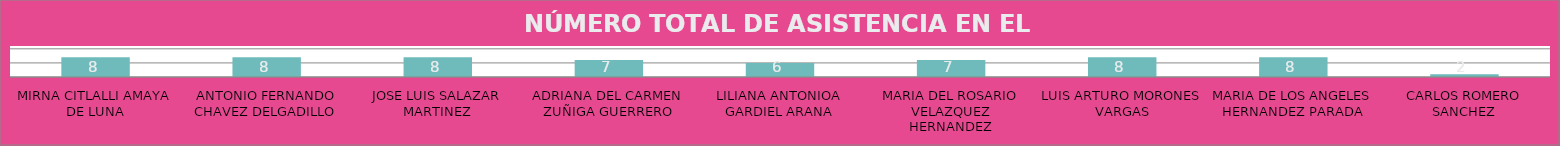
| Category | MIRNA CITLALLI AMAYA DE LUNA |
|---|---|
| MIRNA CITLALLI AMAYA DE LUNA | 8 |
| ANTONIO FERNANDO CHAVEZ DELGADILLO | 8 |
| JOSE LUIS SALAZAR MARTINEZ | 8 |
| ADRIANA DEL CARMEN ZUÑIGA GUERRERO | 7 |
| LILIANA ANTONIOA GARDIEL ARANA | 6 |
| MARIA DEL ROSARIO VELAZQUEZ HERNANDEZ | 7 |
| LUIS ARTURO MORONES VARGAS | 8 |
| MARIA DE LOS ANGELES HERNANDEZ PARADA | 8 |
| CARLOS ROMERO SANCHEZ | 2 |